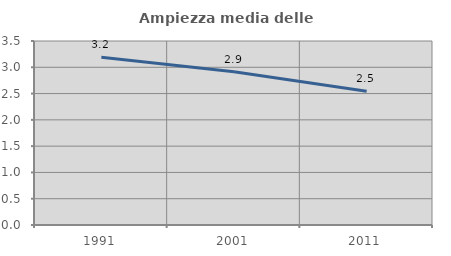
| Category | Ampiezza media delle famiglie |
|---|---|
| 1991.0 | 3.189 |
| 2001.0 | 2.915 |
| 2011.0 | 2.546 |